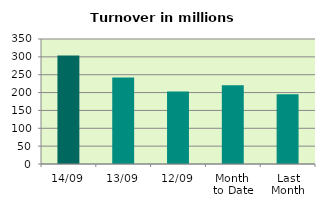
| Category | Series 0 |
|---|---|
| 14/09 | 304.144 |
| 13/09 | 241.953 |
| 12/09 | 203.296 |
| Month 
to Date | 220.827 |
| Last
Month | 195.366 |